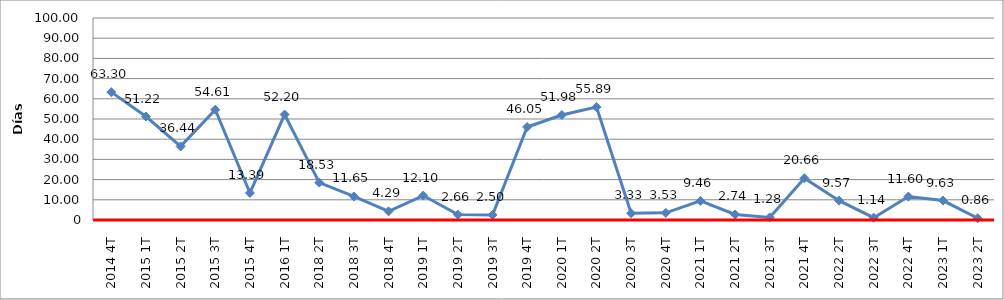
| Category | Series 0 |
|---|---|
| 2014 4T | 63.3 |
| 2015 1T | 51.22 |
| 2015 2T | 36.44 |
| 2015 3T | 54.61 |
| 2015 4T | 13.39 |
| 2016 1T | 52.2 |
| 2018 2T | 18.53 |
| 2018 3T | 11.65 |
| 2018 4T | 4.29 |
| 2019 1T | 12.1 |
| 2019 2T | 2.66 |
| 2019 3T | 2.5 |
| 2019 4T | 46.05 |
| 2020 1T | 51.98 |
| 2020 2T | 55.89 |
| 2020 3T | 3.33 |
| 2020 4T | 3.53 |
| 2021 1T | 9.46 |
| 2021 2T | 2.74 |
| 2021 3T | 1.28 |
| 2021 4T | 20.66 |
| 2022 2T | 9.57 |
| 2022 3T | 1.14 |
| 2022 4T | 11.6 |
| 2023 1T | 9.63 |
| 2023 2T | 0.86 |